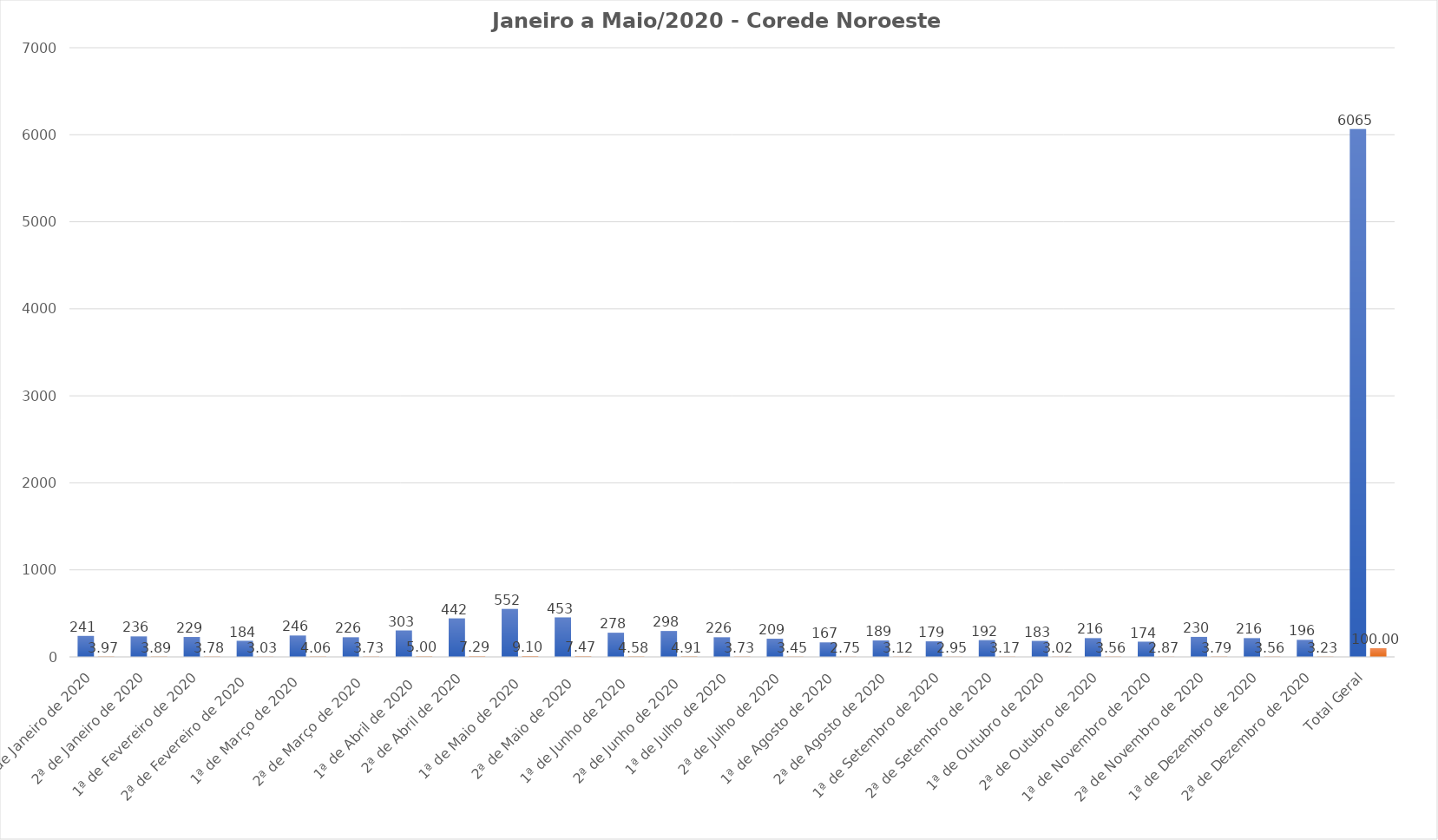
| Category | Series 0 | Series 1 |
|---|---|---|
| 1ª de Janeiro de 2020 | 241 | 3.974 |
| 2ª de Janeiro de 2020 | 236 | 3.891 |
| 1ª de Fevereiro de 2020 | 229 | 3.776 |
| 
2ª de Fevereiro de 2020
 | 184 | 3.034 |
| 
1ª de Março de 2020
 | 246 | 4.056 |
| 
2ª de Março de 2020 | 226 | 3.726 |
| 
1ª de Abril de 2020 | 303 | 4.996 |
| 2ª de Abril de 2020 | 442 | 7.288 |
| 
1ª de Maio de 2020 | 552 | 9.101 |
| 
2ª de Maio de 2020 | 453 | 7.469 |
| 
1ª de Junho de 2020 | 278 | 4.584 |
| 
2ª de Junho de 2020 | 298 | 4.913 |
| 1ª de Julho de 2020 | 226 | 3.726 |
| 2ª de Julho de 2020 | 209 | 3.446 |
| 1ª de Agosto de 2020 | 167 | 2.754 |
| 2ª de Agosto de 2020 | 189 | 3.116 |
| 1ª de Setembro de 2020 | 179 | 2.951 |
| 2ª de Setembro de 2020 | 192 | 3.166 |
| 1ª de Outubro de 2020 | 183 | 3.017 |
| 2ª de Outubro de 2020 | 216 | 3.561 |
| 1ª de Novembro de 2020 | 174 | 2.869 |
| 2ª de Novembro de 2020 | 230 | 3.792 |
| 1ª de Dezembro de 2020 | 216 | 3.561 |
| 2ª de Dezembro de 2020 | 196 | 3.232 |
| Total Geral | 6065 | 100 |